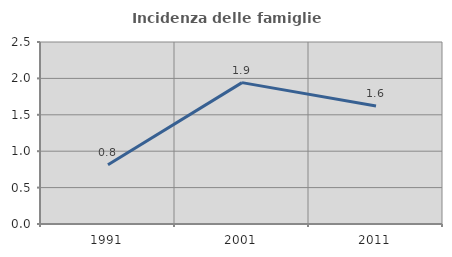
| Category | Incidenza delle famiglie numerose |
|---|---|
| 1991.0 | 0.813 |
| 2001.0 | 1.942 |
| 2011.0 | 1.622 |